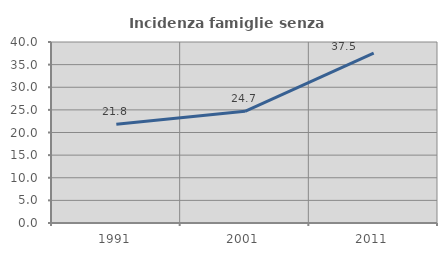
| Category | Incidenza famiglie senza nuclei |
|---|---|
| 1991.0 | 21.825 |
| 2001.0 | 24.684 |
| 2011.0 | 37.531 |